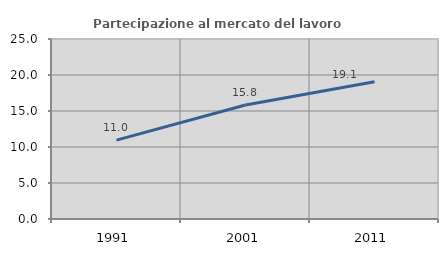
| Category | Partecipazione al mercato del lavoro  femminile |
|---|---|
| 1991.0 | 10.95 |
| 2001.0 | 15.824 |
| 2011.0 | 19.065 |